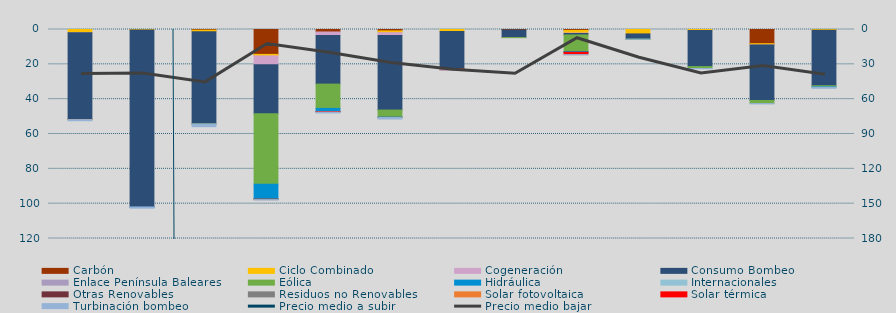
| Category | Carbón | Ciclo Combinado | Cogeneración | Consumo Bombeo | Enlace Península Baleares | Eólica | Hidráulica | Internacionales | Otras Renovables | Residuos no Renovables | Solar fotovoltaica | Solar térmica | Turbinación bombeo |
|---|---|---|---|---|---|---|---|---|---|---|---|---|---|
| 0 | 0 | 1898.2 | 24.2 | 49736.3 | 0 | 105.1 | 0 |  | 0 | 0 | 0.1 | 0 | 619.4 |
| 1 | 0 | 331 | 0 | 101506.1 | 204 | 0 | 106.7 |  | 0 | 0 | 0 | 0 | 462.2 |
| 2 | 376.2 | 910.9 | 0 | 52921.9 | 0 | 42.8 | 0 |  | 0 | 0 | 0 | 0 | 1542.2 |
| 3 | 14289.6 | 859.1 | 5068.8 | 28184.1 | 0 | 40432 | 8486.1 |  | 49.4 | 334.8 | 0 | 0 | 110.8 |
| 4 | 1420.9 | 0 | 2008.3 | 27920 | 0 | 13960.1 | 1762.8 |  | 22.7 | 98.3 | 0 | 224.2 | 474.7 |
| 5 | 808.2 | 1016.6 | 1618.6 | 42815.3 | 0 | 4070.8 | 105.9 |  | 51.2 | 12.8 | 0 | 0 | 879 |
| 6 | 0 | 1097.9 | 0 | 21404.4 | 0 | 137.4 | 0 |  | 0 | 0 | 0 | 518.8 | 108.8 |
| 7 | 294.2 | 0 | 0 | 4310.8 | 42.4 | 0.6 | 0 |  | 0 | 0 | 0 | 0 | 0 |
| 8 | 516.7 | 1537.9 | 257 | 809.6 | 0 | 9502.9 | 408.7 |  | 117.5 | 0 | 0.4 | 1254.7 | 102.9 |
| 9 | 0 | 2533.1 | 0 | 2991.4 | 0 | 42.6 | 0 |  | 0 | 0 | 0 | 0 | 65 |
| 10 | 0 | 555.8 | 0 | 20748.5 | 0 | 1071 | 8.2 |  | 0 | 0 | 0 | 0 | 183.2 |
| 11 | 8149.5 | 754.8 | 3.5 | 31856.3 | 0 | 1760.6 | 0 |  | 0 | 0 | 0 | 0 | 177.8 |
| 12 | 0 | 458.3 | 0 | 31829.7 | 0 | 671.7 | 189.5 |  | 0 | 0 | 0 | 0 | 613.5 |